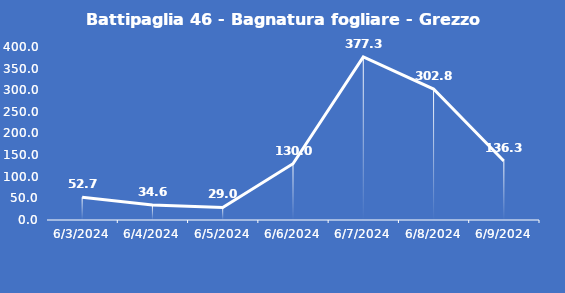
| Category | Battipaglia 46 - Bagnatura fogliare - Grezzo (min) |
|---|---|
| 6/3/24 | 52.7 |
| 6/4/24 | 34.6 |
| 6/5/24 | 29 |
| 6/6/24 | 130 |
| 6/7/24 | 377.3 |
| 6/8/24 | 302.8 |
| 6/9/24 | 136.3 |